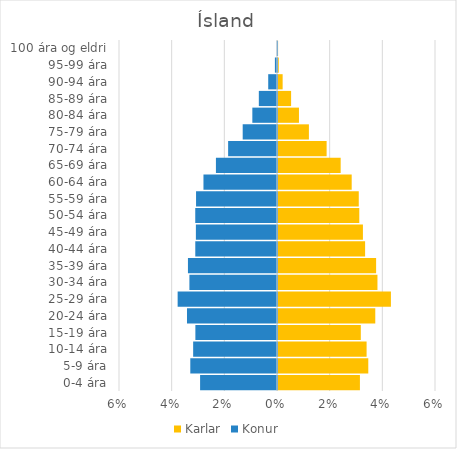
| Category | Karlar | Konur |
|---|---|---|
| 0-4 ára | 0.031 | -0.029 |
| 5-9 ára | 0.034 | -0.033 |
| 10-14 ára | 0.034 | -0.032 |
| 15-19 ára | 0.031 | -0.031 |
| 20-24 ára | 0.037 | -0.034 |
| 25-29 ára | 0.043 | -0.038 |
| 30-34 ára | 0.038 | -0.033 |
| 35-39 ára | 0.037 | -0.034 |
| 40-44 ára | 0.033 | -0.031 |
| 45-49 ára | 0.032 | -0.031 |
| 50-54 ára | 0.031 | -0.031 |
| 55-59 ára | 0.031 | -0.031 |
| 60-64 ára | 0.028 | -0.028 |
| 65-69 ára | 0.024 | -0.023 |
| 70-74 ára | 0.018 | -0.019 |
| 75-79 ára | 0.012 | -0.013 |
| 80-84 ára | 0.008 | -0.009 |
| 85-89 ára | 0.005 | -0.007 |
| 90-94 ára | 0.002 | -0.003 |
| 95-99 ára | 0 | -0.001 |
| 100 ára og eldri | 0 | 0 |